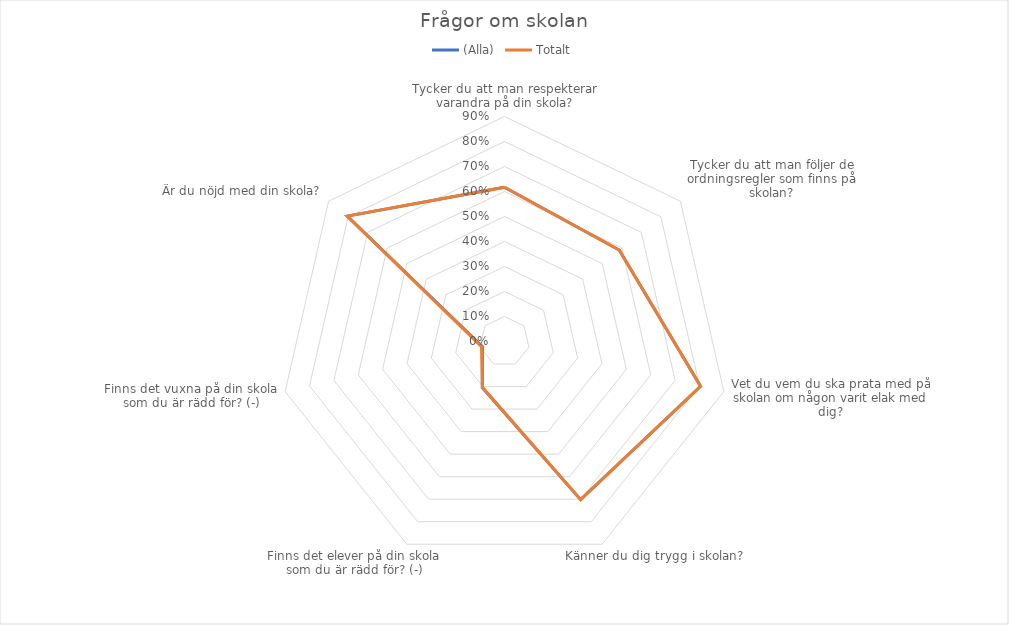
| Category | (Alla) | Totalt |
|---|---|---|
| Tycker du att man respekterar varandra på din skola? | 0.617 | 0.617 |
| Tycker du att man följer de ordningsregler som finns på skolan? | 0.587 | 0.587 |
| Vet du vem du ska prata med på skolan om någon varit elak med dig? | 0.804 | 0.804 |
| Känner du dig trygg i skolan? | 0.702 | 0.702 |
| Finns det elever på din skola som du är rädd för? (-) | 0.205 | 0.203 |
| Finns det vuxna på din skola som du är rädd för? (-) | 0.091 | 0.094 |
| Är du nöjd med din skola? | 0.804 | 0.804 |